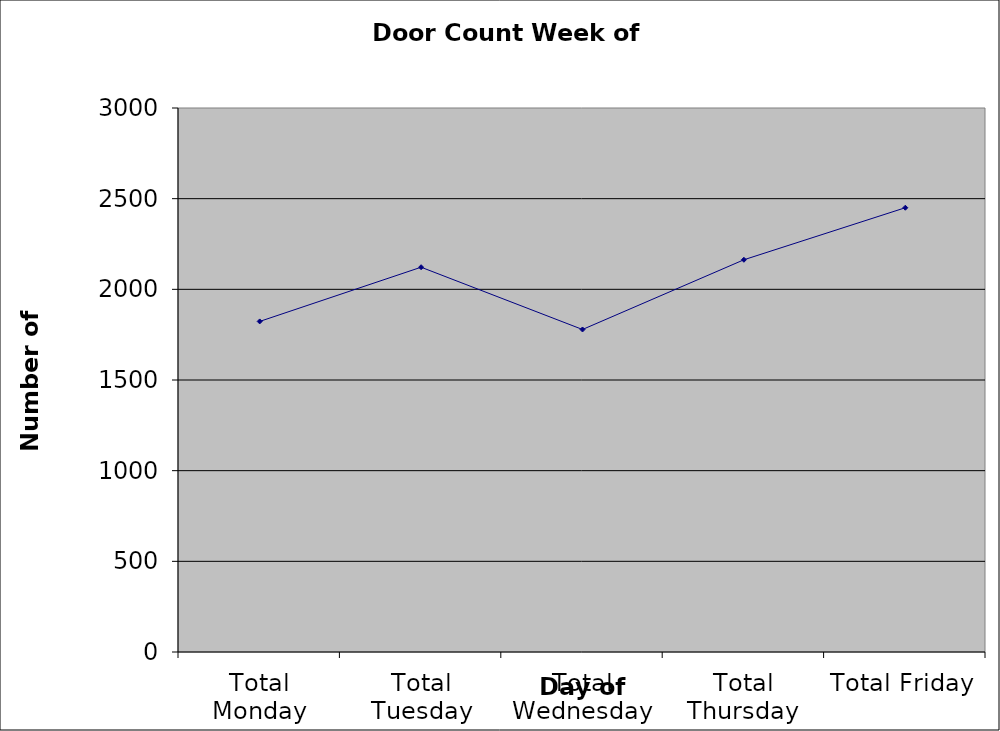
| Category | Series 0 |
|---|---|
| Total Monday | 1823 |
| Total Tuesday | 2122 |
| Total Wednesday | 1778.5 |
| Total Thursday | 2163 |
| Total Friday | 2450 |